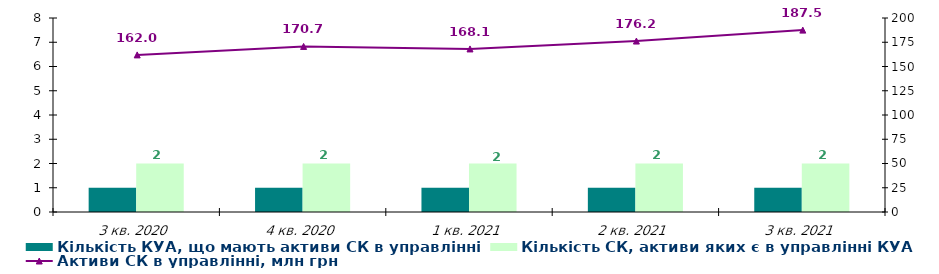
| Category | Кількість КУА, що мають активи СК в управлінні | Кількість СК, активи яких є в управлінні КУА |
|---|---|---|
| 3 кв. 2020 | 1 | 2 |
| 4 кв. 2020 | 1 | 2 |
| 1 кв. 2021 | 1 | 2 |
| 2 кв. 2021 | 1 | 2 |
| 3 кв. 2021 | 1 | 2 |